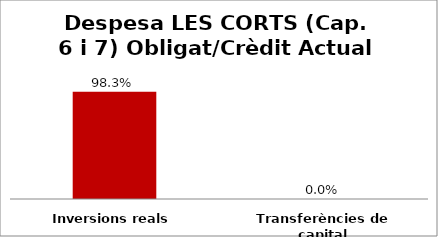
| Category | Series 0 |
|---|---|
| Inversions reals | 0.983 |
| Transferències de capital | 0 |